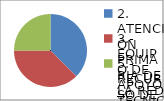
| Category | Series 0 |
|---|---|
| 2. ATENCIÓN PRIMARIA DE
LA RED | 3 |
| 3.- EQUIPO DE APOYO TÉCNICO PERSONAL Y FAMILIAR PARA LA INCLUSIÓN SOCIAL | 3 |
| 5.- RECURSO DE ALOJAMIENTO PARA LA INCLUSIÓN | 2 |